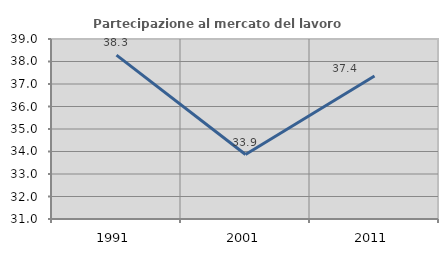
| Category | Partecipazione al mercato del lavoro  femminile |
|---|---|
| 1991.0 | 38.283 |
| 2001.0 | 33.865 |
| 2011.0 | 37.357 |